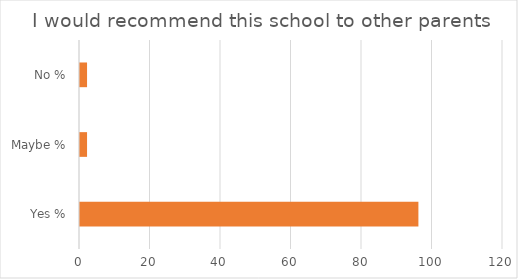
| Category | Series 0 |
|---|---|
| Yes % | 96 |
| Maybe % | 2 |
| No % | 2 |